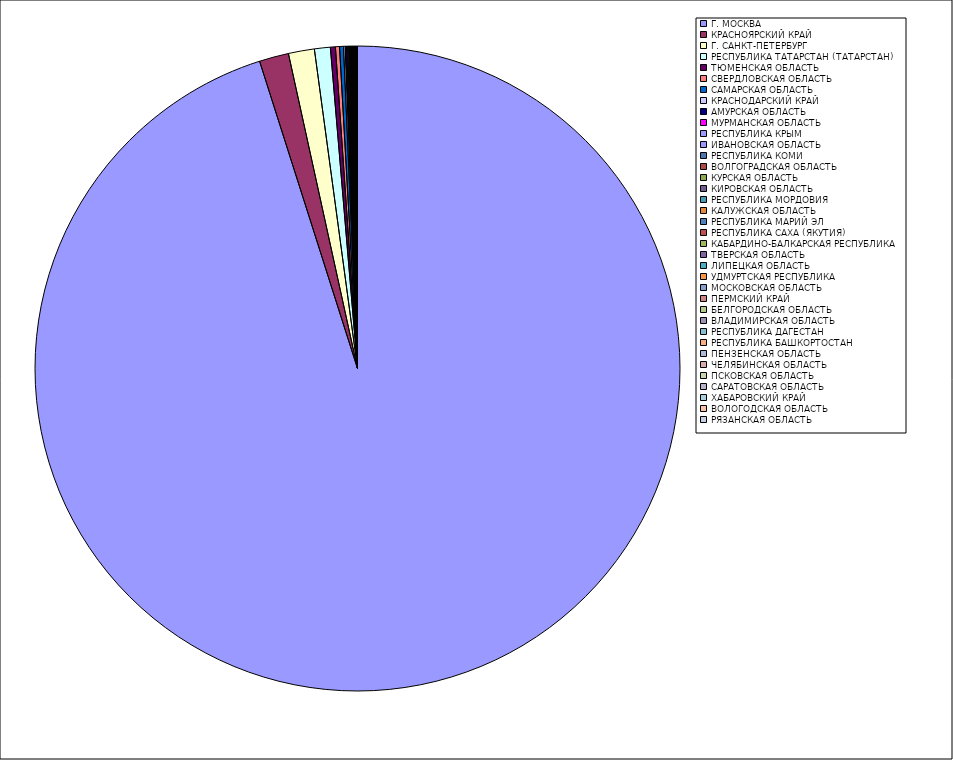
| Category | Оборот |
|---|---|
| Г. МОСКВА | 95.062 |
| КРАСНОЯРСКИЙ КРАЙ | 1.472 |
| Г. САНКТ-ПЕТЕРБУРГ | 1.299 |
| РЕСПУБЛИКА ТАТАРСТАН (ТАТАРСТАН) | 0.795 |
| ТЮМЕНСКАЯ ОБЛАСТЬ | 0.251 |
| СВЕРДЛОВСКАЯ ОБЛАСТЬ | 0.203 |
| САМАРСКАЯ ОБЛАСТЬ | 0.196 |
| КРАСНОДАРСКИЙ КРАЙ | 0.084 |
| АМУРСКАЯ ОБЛАСТЬ | 0.069 |
| МУРМАНСКАЯ ОБЛАСТЬ | 0.052 |
| РЕСПУБЛИКА КРЫМ | 0.049 |
| ИВАНОВСКАЯ ОБЛАСТЬ | 0.038 |
| РЕСПУБЛИКА КОМИ | 0.037 |
| ВОЛГОГРАДСКАЯ ОБЛАСТЬ | 0.03 |
| КУРСКАЯ ОБЛАСТЬ | 0.03 |
| КИРОВСКАЯ ОБЛАСТЬ | 0.027 |
| РЕСПУБЛИКА МОРДОВИЯ | 0.025 |
| КАЛУЖСКАЯ ОБЛАСТЬ | 0.025 |
| РЕСПУБЛИКА МАРИЙ ЭЛ | 0.022 |
| РЕСПУБЛИКА САХА (ЯКУТИЯ) | 0.022 |
| КАБАРДИНО-БАЛКАРСКАЯ РЕСПУБЛИКА | 0.021 |
| ТВЕРСКАЯ ОБЛАСТЬ | 0.017 |
| ЛИПЕЦКАЯ ОБЛАСТЬ | 0.017 |
| УДМУРТСКАЯ РЕСПУБЛИКА | 0.016 |
| МОСКОВСКАЯ ОБЛАСТЬ | 0.012 |
| ПЕРМСКИЙ КРАЙ | 0.011 |
| БЕЛГОРОДСКАЯ ОБЛАСТЬ | 0.011 |
| ВЛАДИМИРСКАЯ ОБЛАСТЬ | 0.01 |
| РЕСПУБЛИКА ДАГЕСТАН | 0.009 |
| РЕСПУБЛИКА БАШКОРТОСТАН | 0.009 |
| ПЕНЗЕНСКАЯ ОБЛАСТЬ | 0.008 |
| ЧЕЛЯБИНСКАЯ ОБЛАСТЬ | 0.008 |
| ПСКОВСКАЯ ОБЛАСТЬ | 0.008 |
| САРАТОВСКАЯ ОБЛАСТЬ | 0.007 |
| ХАБАРОВСКИЙ КРАЙ | 0.007 |
| ВОЛОГОДСКАЯ ОБЛАСТЬ | 0.006 |
| РЯЗАНСКАЯ ОБЛАСТЬ | 0.005 |